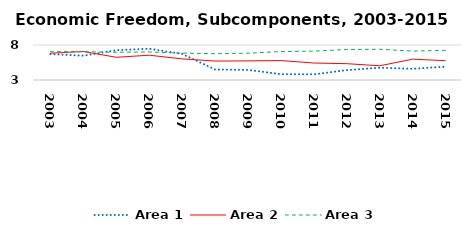
| Category | Area 1 | Area 2 | Area 3 |
|---|---|---|---|
| 2003.0 | 6.703 | 6.83 | 7.046 |
| 2004.0 | 6.471 | 7.073 | 7.047 |
| 2005.0 | 7.259 | 6.245 | 6.961 |
| 2006.0 | 7.468 | 6.542 | 7.006 |
| 2007.0 | 6.719 | 6.017 | 6.84 |
| 2008.0 | 4.499 | 5.705 | 6.758 |
| 2009.0 | 4.438 | 5.732 | 6.827 |
| 2010.0 | 3.838 | 5.779 | 7.064 |
| 2011.0 | 3.813 | 5.424 | 7.129 |
| 2012.0 | 4.412 | 5.333 | 7.351 |
| 2013.0 | 4.758 | 5.029 | 7.388 |
| 2014.0 | 4.601 | 5.974 | 7.135 |
| 2015.0 | 4.905 | 5.76 | 7.232 |